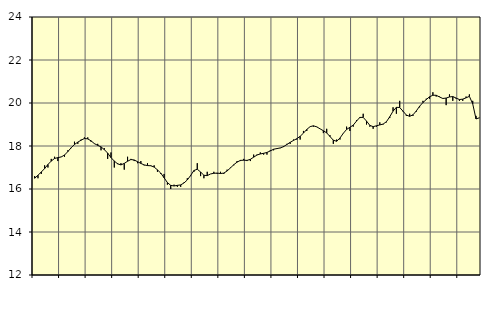
| Category | Piggar | Vård och omsorg, SNI 86-88 |
|---|---|---|
| nan | 16.6 | 16.5 |
| 87.0 | 16.5 | 16.64 |
| 87.0 | 16.7 | 16.79 |
| 87.0 | 17.1 | 16.95 |
| nan | 17 | 17.14 |
| 88.0 | 17.4 | 17.3 |
| 88.0 | 17.5 | 17.42 |
| 88.0 | 17.3 | 17.46 |
| nan | 17.5 | 17.49 |
| 89.0 | 17.5 | 17.58 |
| 89.0 | 17.8 | 17.74 |
| 89.0 | 17.9 | 17.92 |
| nan | 18.2 | 18.07 |
| 90.0 | 18.1 | 18.18 |
| 90.0 | 18.3 | 18.27 |
| 90.0 | 18.4 | 18.35 |
| nan | 18.4 | 18.33 |
| 91.0 | 18.2 | 18.24 |
| 91.0 | 18.1 | 18.11 |
| 91.0 | 18.1 | 18.03 |
| nan | 17.8 | 17.96 |
| 92.0 | 17.9 | 17.83 |
| 92.0 | 17.4 | 17.67 |
| 92.0 | 17.7 | 17.46 |
| nan | 17 | 17.3 |
| 93.0 | 17.2 | 17.17 |
| 93.0 | 17.2 | 17.12 |
| 93.0 | 16.9 | 17.19 |
| nan | 17.5 | 17.29 |
| 94.0 | 17.4 | 17.37 |
| 94.0 | 17.3 | 17.35 |
| 94.0 | 17.2 | 17.27 |
| nan | 17.3 | 17.19 |
| 95.0 | 17.1 | 17.12 |
| 95.0 | 17.2 | 17.09 |
| 95.0 | 17.1 | 17.08 |
| nan | 17.1 | 17.02 |
| 96.0 | 16.8 | 16.89 |
| 96.0 | 16.7 | 16.74 |
| 96.0 | 16.7 | 16.52 |
| nan | 16.2 | 16.3 |
| 97.0 | 16 | 16.17 |
| 97.0 | 16.2 | 16.14 |
| 97.0 | 16.1 | 16.17 |
| nan | 16.1 | 16.19 |
| 98.0 | 16.3 | 16.28 |
| 98.0 | 16.5 | 16.42 |
| 98.0 | 16.6 | 16.63 |
| nan | 16.8 | 16.86 |
| 99.0 | 17.2 | 16.92 |
| 99.0 | 16.6 | 16.79 |
| 99.0 | 16.5 | 16.64 |
| nan | 16.8 | 16.62 |
| 0.0 | 16.7 | 16.7 |
| 0.0 | 16.8 | 16.73 |
| 0.0 | 16.7 | 16.74 |
| nan | 16.8 | 16.72 |
| 1.0 | 16.7 | 16.74 |
| 1.0 | 16.9 | 16.84 |
| 1.0 | 17 | 16.98 |
| nan | 17.1 | 17.13 |
| 2.0 | 17.3 | 17.25 |
| 2.0 | 17.3 | 17.33 |
| 2.0 | 17.4 | 17.34 |
| nan | 17.3 | 17.33 |
| 3.0 | 17.3 | 17.38 |
| 3.0 | 17.6 | 17.48 |
| 3.0 | 17.6 | 17.58 |
| nan | 17.7 | 17.63 |
| 4.0 | 17.6 | 17.66 |
| 4.0 | 17.6 | 17.7 |
| 4.0 | 17.8 | 17.77 |
| nan | 17.8 | 17.85 |
| 5.0 | 17.9 | 17.88 |
| 5.0 | 17.9 | 17.91 |
| 5.0 | 18 | 17.97 |
| nan | 18.1 | 18.07 |
| 6.0 | 18.1 | 18.17 |
| 6.0 | 18.3 | 18.26 |
| 6.0 | 18.3 | 18.34 |
| nan | 18.3 | 18.45 |
| 7.0 | 18.7 | 18.6 |
| 7.0 | 18.7 | 18.77 |
| 7.0 | 18.9 | 18.9 |
| nan | 18.9 | 18.94 |
| 8.0 | 18.9 | 18.89 |
| 8.0 | 18.8 | 18.8 |
| 8.0 | 18.6 | 18.71 |
| nan | 18.8 | 18.61 |
| 9.0 | 18.5 | 18.44 |
| 9.0 | 18.1 | 18.27 |
| 9.0 | 18.3 | 18.22 |
| nan | 18.3 | 18.37 |
| 10.0 | 18.6 | 18.59 |
| 10.0 | 18.9 | 18.77 |
| 10.0 | 18.7 | 18.87 |
| nan | 18.9 | 18.97 |
| 11.0 | 19.2 | 19.16 |
| 11.0 | 19.3 | 19.33 |
| 11.0 | 19.5 | 19.33 |
| nan | 19 | 19.16 |
| 12.0 | 18.9 | 18.96 |
| 12.0 | 18.8 | 18.9 |
| 12.0 | 18.9 | 18.94 |
| nan | 19.1 | 18.98 |
| 13.0 | 19 | 19.02 |
| 13.0 | 19.1 | 19.13 |
| 13.0 | 19.3 | 19.36 |
| nan | 19.8 | 19.62 |
| 14.0 | 19.5 | 19.8 |
| 14.0 | 20.1 | 19.79 |
| 14.0 | 19.6 | 19.62 |
| nan | 19.4 | 19.44 |
| 15.0 | 19.5 | 19.38 |
| 15.0 | 19.4 | 19.45 |
| 15.0 | 19.6 | 19.63 |
| nan | 19.8 | 19.85 |
| 16.0 | 20.1 | 20.02 |
| 16.0 | 20.2 | 20.16 |
| 16.0 | 20.2 | 20.29 |
| nan | 20.5 | 20.36 |
| 17.0 | 20.3 | 20.36 |
| 17.0 | 20.3 | 20.28 |
| 17.0 | 20.2 | 20.21 |
| nan | 19.9 | 20.23 |
| 18.0 | 20.4 | 20.28 |
| 18.0 | 20.1 | 20.3 |
| 18.0 | 20.2 | 20.23 |
| nan | 20.1 | 20.16 |
| 19.0 | 20.1 | 20.18 |
| 19.0 | 20.3 | 20.24 |
| 19.0 | 20.4 | 20.31 |
| nan | 20.1 | 19.96 |
| 20.0 | 19.4 | 19.26 |
| 20.0 | 19.3 | 19.31 |